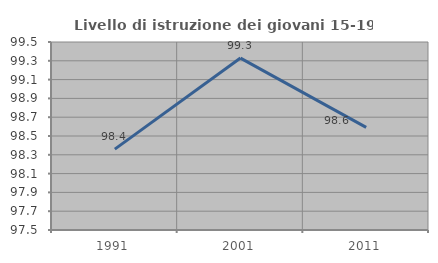
| Category | Livello di istruzione dei giovani 15-19 anni |
|---|---|
| 1991.0 | 98.361 |
| 2001.0 | 99.329 |
| 2011.0 | 98.592 |